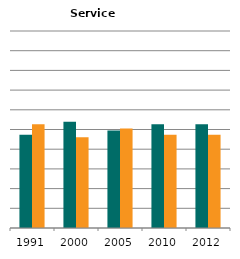
| Category | Male | Female |
|---|---|---|
| 1991.0 | 0.473 | 0.527 |
| 2000.0 | 0.54 | 0.46 |
| 2005.0 | 0.495 | 0.505 |
| 2010.0 | 0.527 | 0.473 |
| 2012.0 | 0.526 | 0.474 |